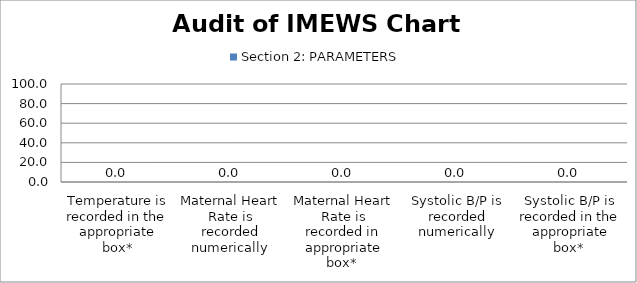
| Category | Section 2: PARAMETERS |
|---|---|
| Temperature is recorded in the appropriate box* | 0 |
| Maternal Heart Rate is recorded numerically | 0 |
| Maternal Heart Rate is recorded in appropriate box*  | 0 |
| Systolic B/P is recorded numerically | 0 |
| Systolic B/P is recorded in the appropriate box*  | 0 |